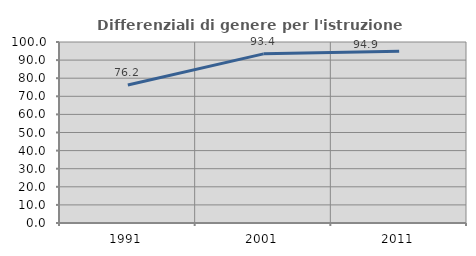
| Category | Differenziali di genere per l'istruzione superiore |
|---|---|
| 1991.0 | 76.21 |
| 2001.0 | 93.445 |
| 2011.0 | 94.896 |